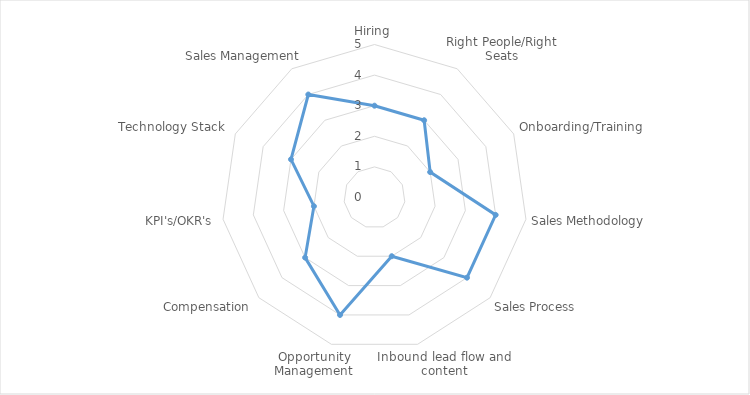
| Category | Rank |
|---|---|
| Hiring | 3 |
| Right People/Right Seats | 3 |
| Onboarding/Training | 2 |
| Sales Methodology | 4 |
| Sales Process | 4 |
| Inbound lead flow and content | 2 |
| Opportunity Management | 4 |
| Compensation | 3 |
| KPI's/OKR's | 2 |
| Technology Stack | 3 |
| Sales Management | 4 |